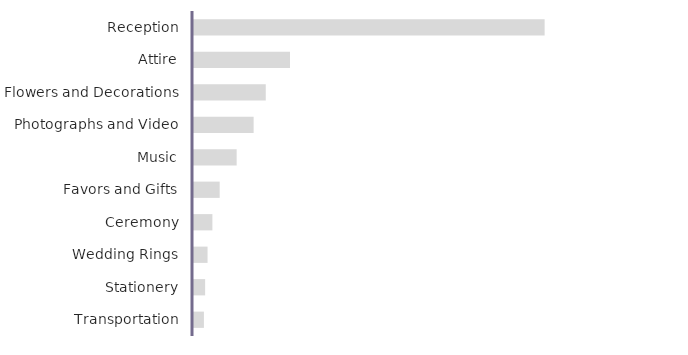
| Category | Estimated Costs |
|---|---|
| Reception | 14500 |
| Attire | 4000 |
| Flowers and Decorations | 3000 |
| Photographs and Video | 2500 |
| Music | 1800 |
| Favors and Gifts | 1100 |
| Ceremony | 800 |
| Wedding Rings | 600 |
| Stationery | 500 |
| Transportation | 450 |